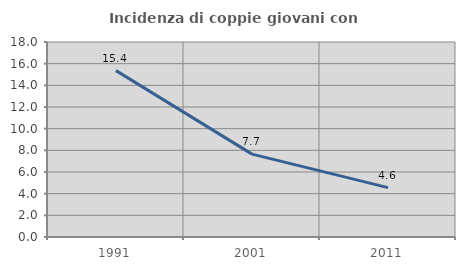
| Category | Incidenza di coppie giovani con figli |
|---|---|
| 1991.0 | 15.359 |
| 2001.0 | 7.65 |
| 2011.0 | 4.558 |